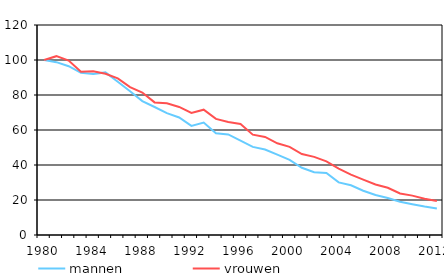
| Category | mannen | vrouwen |
|---|---|---|
| 1980.0 | 100 | 100 |
| 1981.0 | 98.765 | 102.187 |
| 1982.0 | 96.44 | 99.639 |
| 1983.0 | 92.678 | 93.242 |
| 1984.0 | 91.978 | 93.552 |
| 1985.0 | 92.919 | 92.145 |
| 1986.0 | 87.587 | 89.501 |
| 1987.0 | 82.121 | 84.504 |
| 1988.0 | 76.522 | 81.398 |
| 1989.0 | 73.13 | 75.769 |
| 1990.0 | 69.652 | 75.273 |
| 1991.0 | 67.168 | 73.156 |
| 1992.0 | 62.372 | 69.708 |
| 1993.0 | 64.296 | 71.592 |
| 1994.0 | 58.192 | 66.345 |
| 1995.0 | 57.45 | 64.52 |
| 1996.0 | 53.987 | 63.42 |
| 1997.0 | 50.336 | 57.345 |
| 1998.0 | 48.88 | 56.054 |
| 1999.0 | 45.952 | 52.404 |
| 2000.0 | 42.949 | 50.349 |
| 2001.0 | 38.394 | 46.242 |
| 2002.0 | 35.918 | 44.661 |
| 2003.0 | 35.484 | 42.079 |
| 2004.0 | 30.071 | 37.986 |
| 2005.0 | 28.392 | 34.526 |
| 2006.0 | 25.305 | 31.613 |
| 2007.0 | 22.866 | 28.869 |
| 2008.0 | 21.176 | 26.988 |
| 2009.0 | 18.986 | 23.698 |
| 2010.0 | 17.573 | 22.498 |
| 2011.0 | 16.247 | 20.736 |
| 2012.0 | 15.112 | 19.448 |